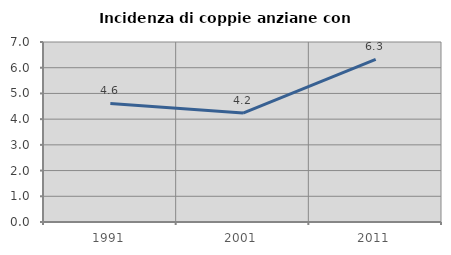
| Category | Incidenza di coppie anziane con figli |
|---|---|
| 1991.0 | 4.611 |
| 2001.0 | 4.237 |
| 2011.0 | 6.322 |